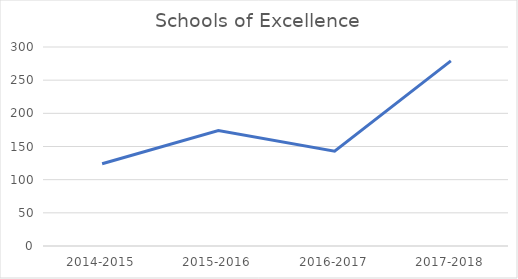
| Category | Schools of Excellence |
|---|---|
| 2014-2015 | 124 |
| 2015-2016 | 174 |
| 2016-2017 | 143 |
| 2017-2018 | 279 |